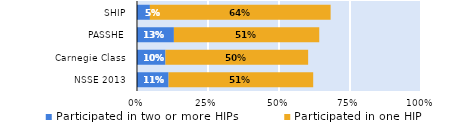
| Category | Participated in two or more HIPs | Participated in one HIP |
|---|---|---|
| NSSE 2013 | 0.111 | 0.509 |
| Carnegie Class | 0.1 | 0.502 |
| PASSHE | 0.13 | 0.512 |
| SHIP | 0.045 | 0.636 |